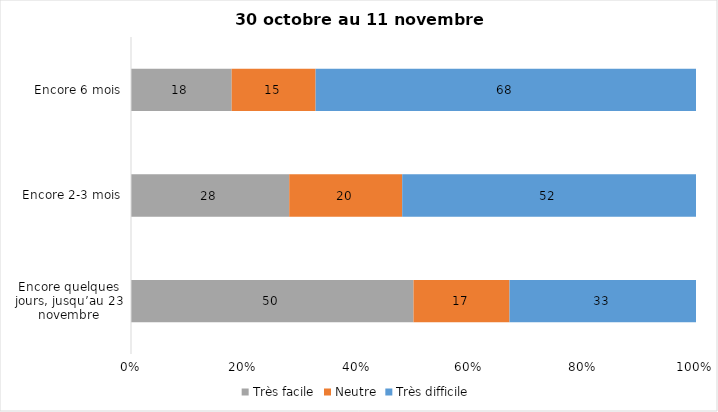
| Category | Très facile | Neutre | Très difficile |
|---|---|---|---|
| Encore quelques jours, jusqu’au 23 novembre | 50 | 17 | 33 |
| Encore 2-3 mois | 28 | 20 | 52 |
| Encore 6 mois | 18 | 15 | 68 |